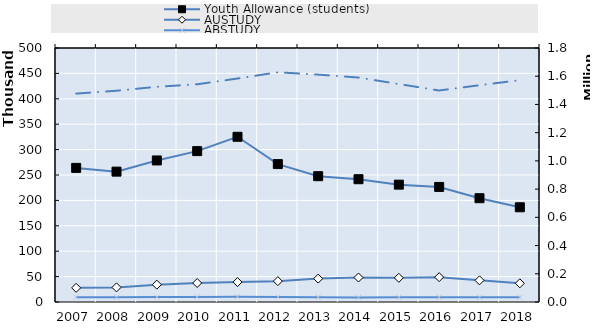
| Category | Youth Allowance (students) | AUSTUDY | 0 | Series 14 | Series 15 | Series 16 | Series 17 | Series 18 | Series 19 |
|---|---|---|---|---|---|---|---|---|---|
| 2007.0 | 264008 | 27869 |  |  |  |  |  |  |  |
| 2008.0 | 256634 | 28776 |  |  |  |  |  |  |  |
| 2009.0 | 278664 | 34175 |  |  |  |  |  |  |  |
| 2010.0 | 297023 | 37342 |  |  |  |  |  |  |  |
| 2011.0 | 325224 | 39213 |  |  |  |  |  |  |  |
| 2012.0 | 271472 | 41042 |  |  |  |  |  |  |  |
| 2013.0 | 247656 | 46039 |  |  |  |  |  |  |  |
| 2014.0 | 241670 | 48197 |  |  |  |  |  |  |  |
| 2015.0 | 231018 | 47569 |  |  |  |  |  |  |  |
| 2016.0 | 226515 | 48910 |  |  |  |  |  |  |  |
| 2017.0 | 204323 | 42642 |  |  |  |  |  |  |  |
| 2018.0 | 186457 | 36772 |  |  |  |  |  |  |  |